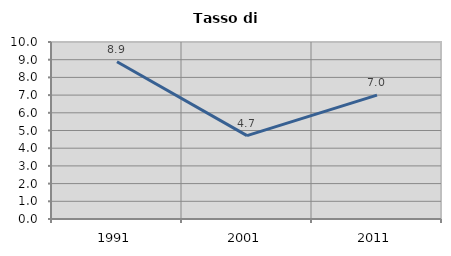
| Category | Tasso di disoccupazione   |
|---|---|
| 1991.0 | 8.886 |
| 2001.0 | 4.708 |
| 2011.0 | 6.997 |